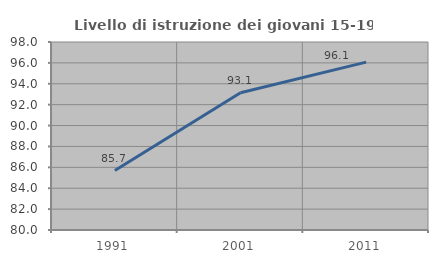
| Category | Livello di istruzione dei giovani 15-19 anni |
|---|---|
| 1991.0 | 85.688 |
| 2001.0 | 93.138 |
| 2011.0 | 96.069 |